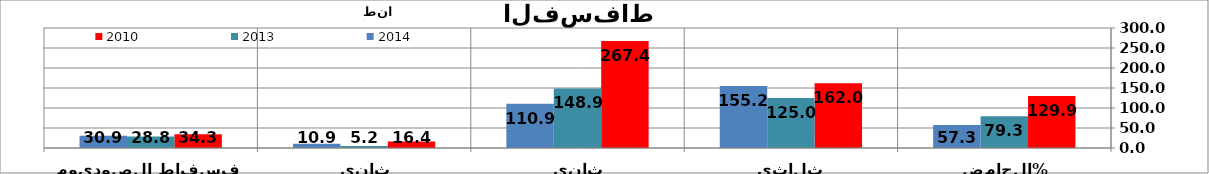
| Category | 2010 | 2013 | 2014 |
|---|---|---|---|
| الحامض الفسفوري 54% | 129.873 | 79.347 | 57.251 |
| ثلاثي الفسفاط الرفيع | 161.99 | 124.96 | 155.23 |
| ثاني فسفاط الأمونيا | 267.353 | 148.85 | 110.905 |
| ثاني فسفاط الكلس | 16.375 | 5.2 | 10.9 |
| فسفاط الصوديوم | 34.262 | 28.767 | 30.852 |